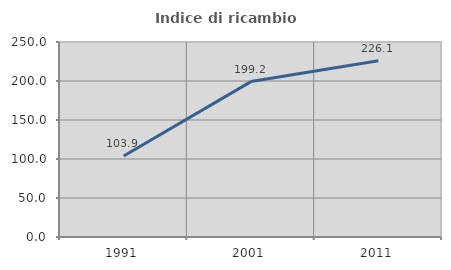
| Category | Indice di ricambio occupazionale  |
|---|---|
| 1991.0 | 103.881 |
| 2001.0 | 199.24 |
| 2011.0 | 226.074 |